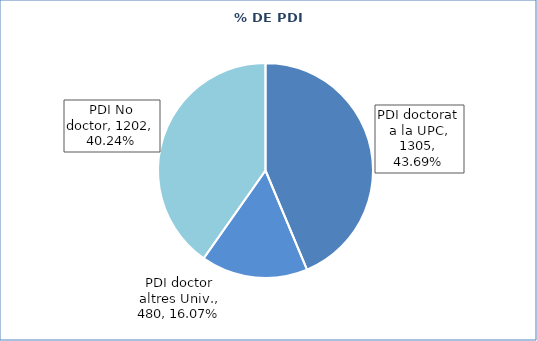
| Category | Series 0 |
|---|---|
| PDI doctorat a la UPC | 1305 |
| PDI doctor altres Univ. | 480 |
| PDI No doctor | 1202 |